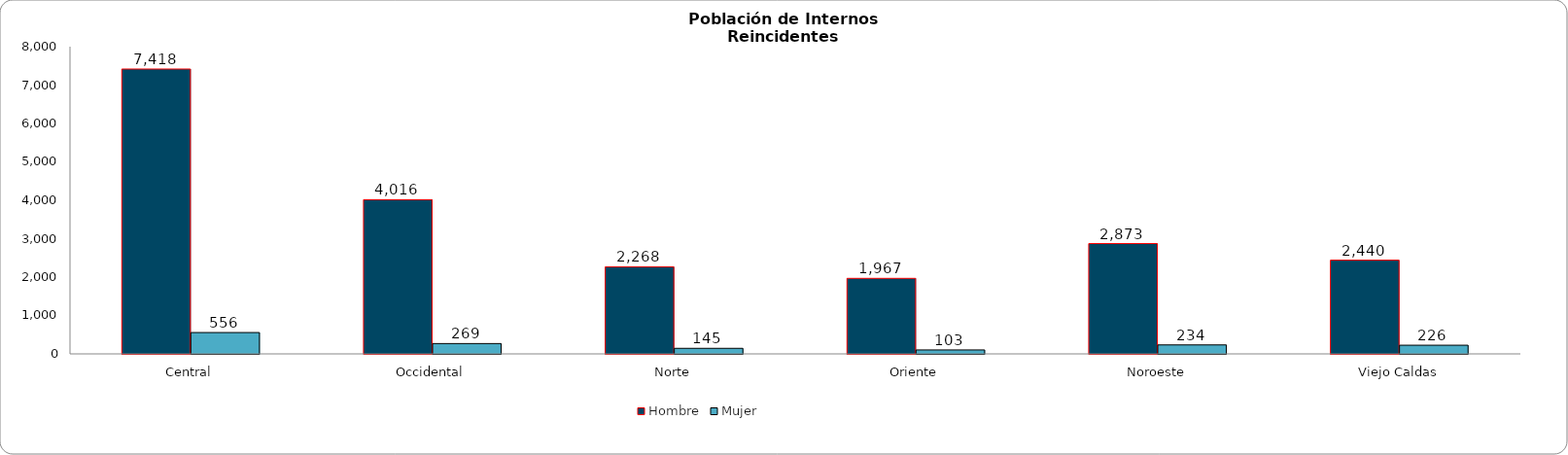
| Category | Hombre | Mujer |
|---|---|---|
| Central | 7418 | 556 |
| Occidental | 4016 | 269 |
| Norte | 2268 | 145 |
| Oriente | 1967 | 103 |
| Noroeste | 2873 | 234 |
| Viejo Caldas | 2440 | 226 |